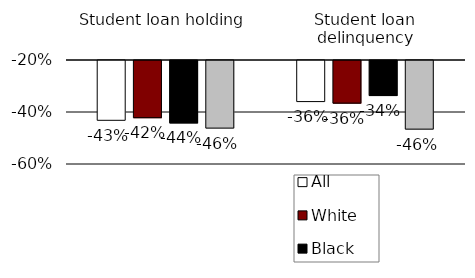
| Category | All | White | Black | Hispanic |
|---|---|---|---|---|
| Student loan holding | -0.43 | -0.42 | -0.44 | -0.46 |
| Student loan delinquency | -0.358 | -0.364 | -0.335 | -0.464 |